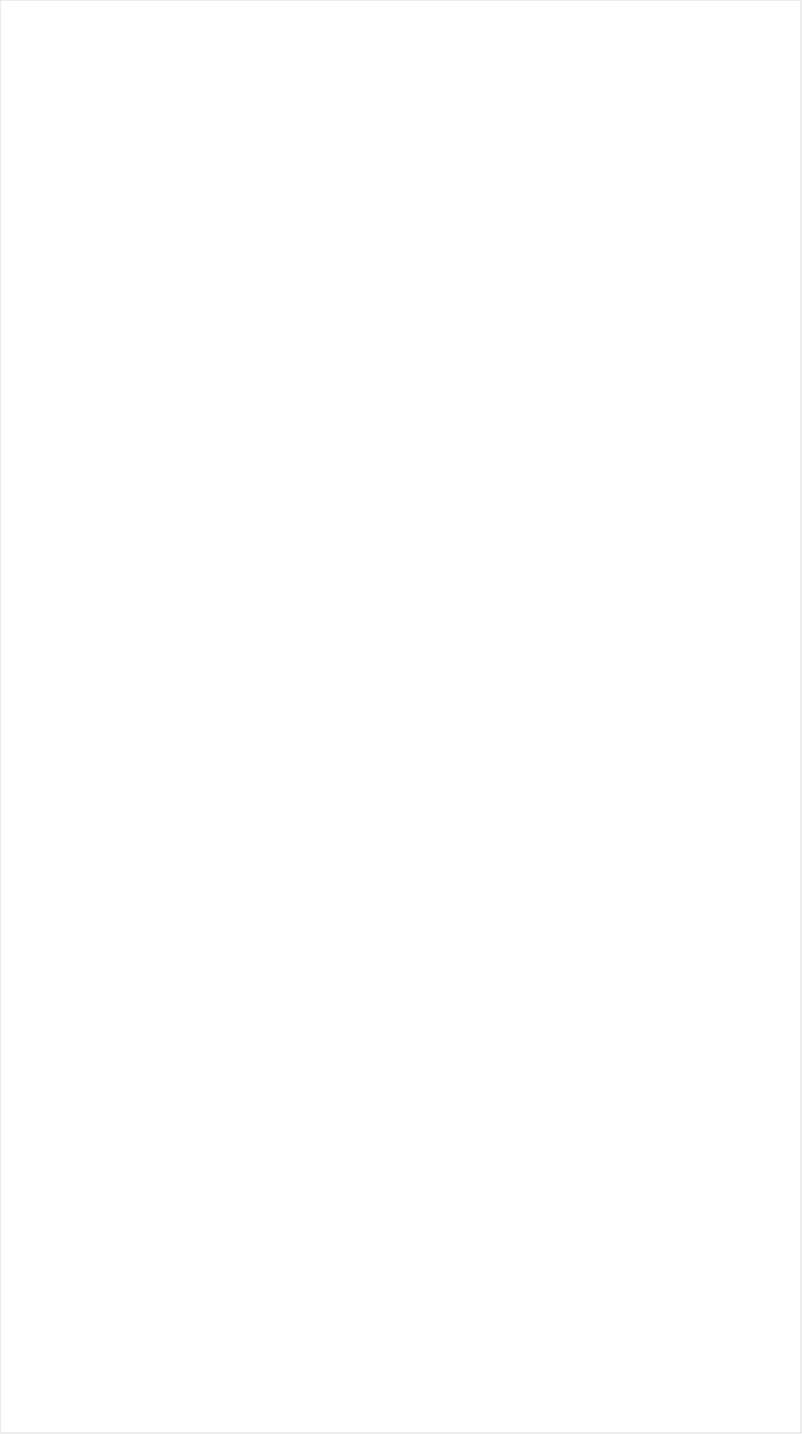
| Category | Total |
|---|---|
| Galavision | -0.924 |
| Univision | -0.863 |
| Telemundo | -0.851 |
| NBC Universo | -0.837 |
| UniMas | -0.834 |
| TUDN | -0.827 |
| BET | -0.691 |
| TV ONE | -0.688 |
| VH1 | -0.677 |
| Cartoon Network | -0.636 |
| MTV2 | -0.623 |
| BET Her | -0.594 |
| Disney Channel | -0.54 |
| Nick Toons | -0.539 |
| Logo | -0.529 |
| Nick | -0.516 |
| Adult Swim | -0.507 |
| Disney XD | -0.5 |
| Lifetime Movies | -0.498 |
| Nick Jr. | -0.473 |
| Teen Nick | -0.466 |
| Universal Kids | -0.397 |
| Discovery Life Channel | -0.387 |
| Oprah Winfrey Network | -0.387 |
| WE TV | -0.374 |
| Travel | -0.364 |
| TLC | -0.349 |
| Disney Junior US | -0.349 |
| Investigation Discovery | -0.345 |
| Lifetime | -0.308 |
| Nick@Nite | -0.298 |
| Discovery Family Channel | -0.285 |
| FXDEP | -0.279 |
| UP TV | -0.263 |
| MTV | -0.232 |
| USA Network | -0.228 |
| SYFY | -0.194 |
| A&E | -0.19 |
| E! | -0.186 |
| Headline News | -0.184 |
| OXYGEN | -0.182 |
| FXX | -0.178 |
| CW | -0.154 |
| Hallmark | -0.153 |
| Hallmark Movies & Mysteries | -0.147 |
| CMTV | -0.139 |
| FX | -0.122 |
| Freeform | -0.116 |
| INSP | -0.114 |
| ION | -0.112 |
| POP | -0.077 |
| truTV | -0.048 |
| Great American Country | -0.042 |
| Paramount Network | -0.034 |
| Science Channel | -0.02 |
| TBS | -0.012 |
| TNT | -0.01 |
| BRAVO | -0.007 |
| NBA TV | -0.001 |
| Game Show | 0 |
| FX Movie Channel | 0.008 |
| Viceland | 0.011 |
| National Geographic Wild | 0.036 |
| FOX | 0.038 |
| Reelz Channel | 0.039 |
| TV LAND | 0.05 |
| Comedy Central | 0.056 |
| Motor Trend Network | 0.063 |
| Ovation | 0.073 |
| Animal Planet | 0.091 |
| History Channel | 0.096 |
| Discovery Channel | 0.099 |
| MyNetworkTV | 0.101 |
| RFD TV | 0.106 |
| FYI | 0.107 |
| Food Network | 0.125 |
| Destination America | 0.127 |
| HGTV | 0.129 |
| MSNBC | 0.132 |
| CNN | 0.142 |
| AMC | 0.168 |
| American Heroes Channel | 0.175 |
| Weather Channel | 0.194 |
| WGN America | 0.201 |
| ABC | 0.201 |
| BBC America | 0.238 |
| Cooking Channel | 0.241 |
| National Geographic | 0.241 |
| SundanceTV | 0.275 |
| Smithsonian | 0.353 |
| DIY | 0.358 |
| NBC | 0.387 |
| CBS | 0.391 |
| ESPN Deportes | 0.392 |
| CNBC | 0.407 |
| NFL Network | 0.41 |
| Independent Film (IFC) | 0.412 |
| Fox News | 0.477 |
| The Sportsman Channel | 0.509 |
| PBS | 0.551 |
| Fox Business | 0.602 |
| Outdoor Channel | 0.644 |
| ESPN2 | 0.707 |
| ESPN | 0.709 |
| Fox Sports 1 | 0.712 |
| Olympic Channel | 0.722 |
| Bloomberg HD | 0.785 |
| ESPNEWS | 0.797 |
| FOX Sports 2 | 0.827 |
| ESPNU | 1.074 |
| CBS Sports | 1.13 |
| Big Ten Network | 1.187 |
| Tennis Channel | 1.204 |
| MLB Network | 1.206 |
| NHL | 1.342 |
| PAC-12 Network | 1.398 |
| NBC Sports | 1.656 |
| Golf | 6.256 |